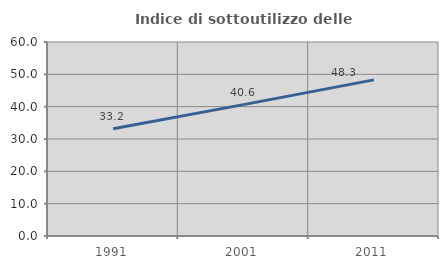
| Category | Indice di sottoutilizzo delle abitazioni  |
|---|---|
| 1991.0 | 33.167 |
| 2001.0 | 40.633 |
| 2011.0 | 48.291 |